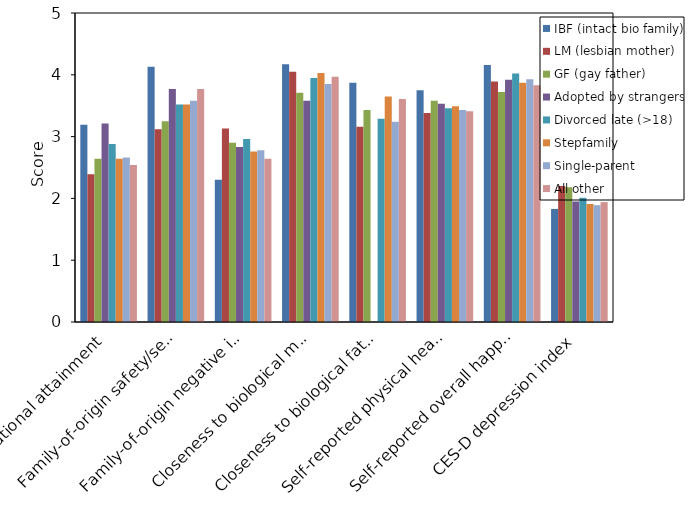
| Category | IBF (intact bio family) | LM (lesbian mother) | GF (gay father) | Adopted by strangers | Divorced late (>18) | Stepfamily | Single-parent | All other |
|---|---|---|---|---|---|---|---|---|
| Educational attainment | 3.19 | 2.39 | 2.64 | 3.21 | 2.88 | 2.64 | 2.66 | 2.54 |
| Family-of-origin safety/security | 4.13 | 3.12 | 3.25 | 3.77 | 3.52 | 3.52 | 3.58 | 3.77 |
| Family-of-origin negative impact | 2.3 | 3.13 | 2.9 | 2.83 | 2.96 | 2.76 | 2.78 | 2.64 |
| Closeness to biological mother | 4.17 | 4.05 | 3.71 | 3.58 | 3.95 | 4.03 | 3.85 | 3.97 |
| Closeness to biological father | 3.87 | 3.16 | 3.43 | 0 | 3.29 | 3.65 | 3.24 | 3.61 |
| Self-reported physical health | 3.75 | 3.38 | 3.58 | 3.53 | 3.46 | 3.49 | 3.43 | 3.41 |
| Self-reported overall happiness | 4.16 | 3.89 | 3.72 | 3.92 | 4.02 | 3.87 | 3.93 | 3.83 |
| CES-D depression index | 1.83 | 2.2 | 2.18 | 1.95 | 2.01 | 1.91 | 1.89 | 1.94 |